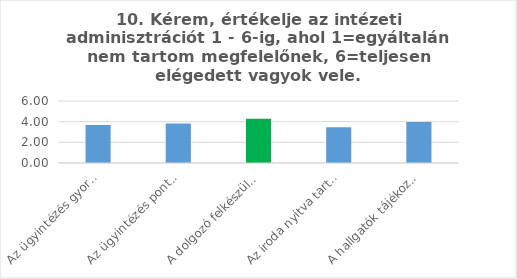
| Category | Series 0 |
|---|---|
| Az ügyintézés gyorsasága | 3.67 |
| Az ügyintézés pontossága | 3.83 |
| A dolgozó felkészültsége, informáltsága | 4.29 |
| Az iroda nyitva tartása, a dolgozó elérhetősége | 3.46 |
| A hallgatók tájékoztatásának minősége | 3.96 |